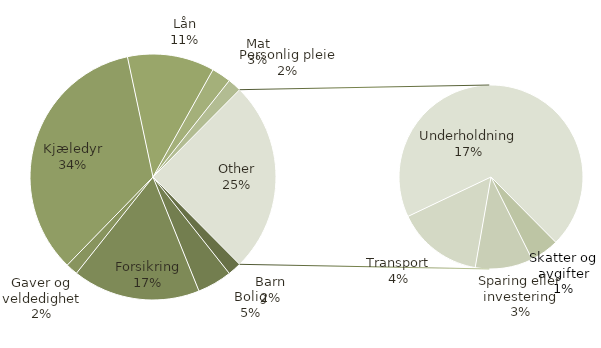
| Category | Totalt |
|---|---|
| Barn | 140 |
| Bolig | 358 |
| Forsikring | 1320 |
| Gaver og veldedighet | 125 |
| Kjæledyr | 2702 |
| Lån | 900 |
| Mat | 200 |
| Personlig pleie | 140 |
| Skatter og avgifter | 100 |
| Sparing eller investering | 200 |
| Transport | 300 |
| Underholdning | 1375 |